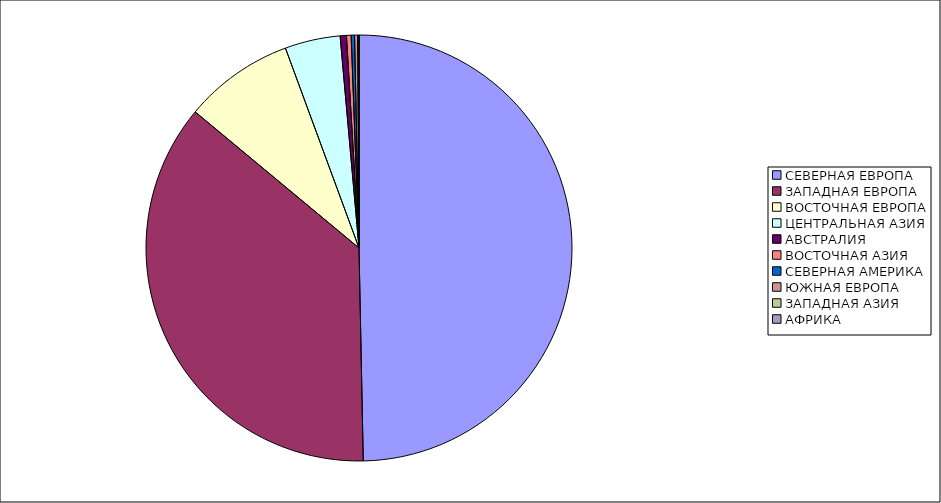
| Category | Оборот |
|---|---|
| СЕВЕРНАЯ ЕВРОПА | 49.681 |
| ЗАПАДНАЯ ЕВРОПА | 36.353 |
| ВОСТОЧНАЯ ЕВРОПА | 8.353 |
| ЦЕНТРАЛЬНАЯ АЗИЯ | 4.198 |
| АВСТРАЛИЯ | 0.474 |
| ВОСТОЧНАЯ АЗИЯ | 0.353 |
| СЕВЕРНАЯ АМЕРИКА | 0.253 |
| ЮЖНАЯ ЕВРОПА | 0.238 |
| ЗАПАДНАЯ АЗИЯ | 0.09 |
| АФРИКА | 0.007 |